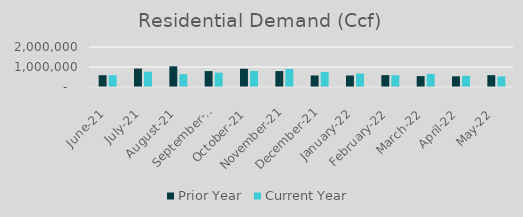
| Category | Prior Year | Current Year |
|---|---|---|
| 2021-06-01 | 588815.728 | 587861.265 |
| 2021-07-01 | 920418.723 | 764849.567 |
| 2021-08-01 | 1034271.241 | 637451.79 |
| 2021-09-01 | 795392.365 | 715703.433 |
| 2021-10-01 | 913450.318 | 802383.882 |
| 2021-11-01 | 796803.85 | 904247.352 |
| 2021-12-01 | 575698.992 | 746791.488 |
| 2022-01-01 | 574964.407 | 670556.394 |
| 2022-02-01 | 591912.627 | 589693.822 |
| 2022-03-01 | 545392.69 | 650741.307 |
| 2022-04-01 | 533967.423 | 560920.541 |
| 2022-05-01 | 591911.753 | 528033 |